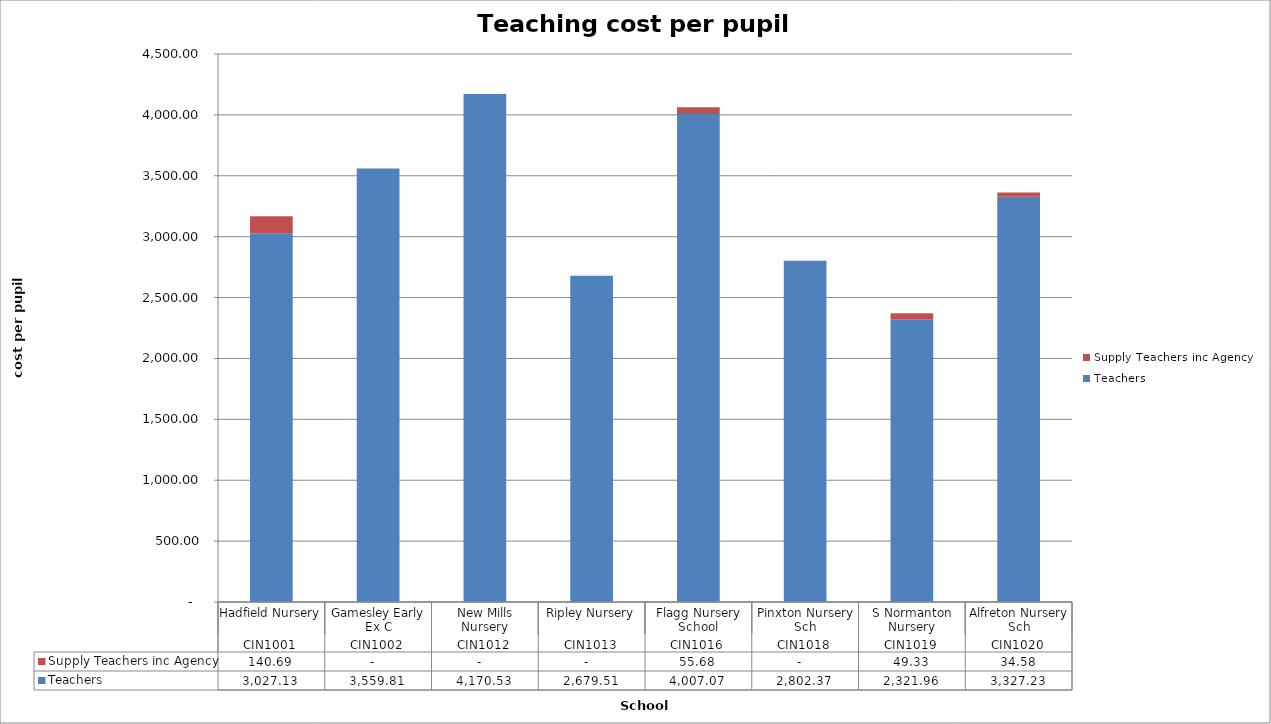
| Category | Teachers | Supply Teachers inc Agency |
|---|---|---|
| 0 | 3027.134 | 140.694 |
| 1 | 3559.812 | 0 |
| 2 | 4170.527 | 0 |
| 3 | 2679.509 | 0 |
| 4 | 4007.074 | 55.683 |
| 5 | 2802.371 | 0 |
| 6 | 2321.962 | 49.328 |
| 7 | 3327.229 | 34.582 |